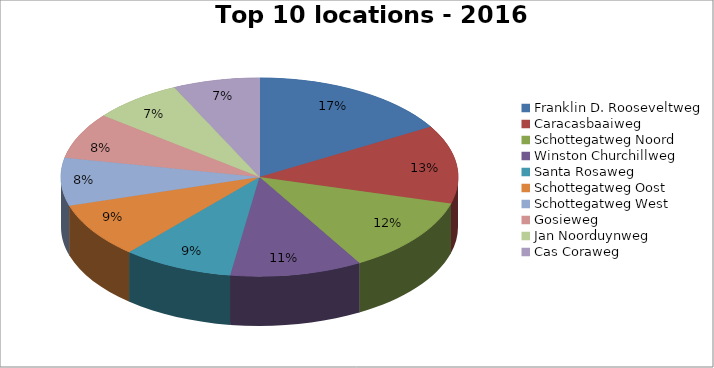
| Category | Series 0 |
|---|---|
| Franklin D. Rooseveltweg | 579 |
| Caracasbaaiweg | 448 |
| Schottegatweg Noord | 431 |
| Winston Churchillweg | 376 |
| Santa Rosaweg | 316 |
| Schottegatweg Oost | 313 |
| Schottegatweg West | 274 |
| Gosieweg | 263 |
| Jan Noorduynweg | 256 |
| Cas Coraweg | 247 |